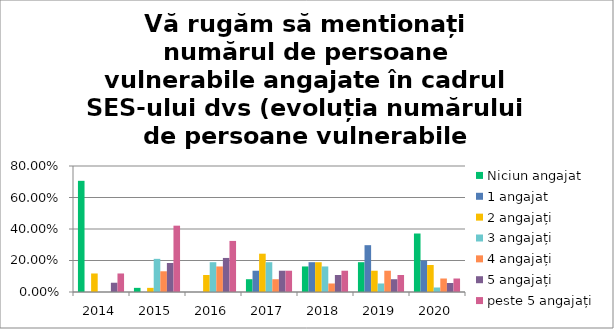
| Category | Niciun angajat | 1 angajat | 2 angajați | 3 angajați | 4 angajați | 5 angajați | peste 5 angajați |
|---|---|---|---|---|---|---|---|
| 2014 | 0.706 | 0 | 0.118 | 0 | 0 | 0.059 | 0.118 |
| 2015 | 0.026 | 0 | 0.026 | 0.21 | 0.132 | 0.184 | 0.421 |
| 2016 | 0 | 0 | 0.108 | 0.189 | 0.162 | 0.216 | 0.324 |
| 2017 | 0.081 | 0.135 | 0.243 | 0.189 | 0.081 | 0.135 | 0.135 |
| 2018 | 0.162 | 0.189 | 0.189 | 0.162 | 0.054 | 0.108 | 0.135 |
| 2019 | 0.189 | 0.297 | 0.135 | 0.054 | 0.135 | 0.081 | 0.108 |
| 2020 | 0.371 | 0.2 | 0.171 | 0.029 | 0.086 | 0.057 | 0.086 |